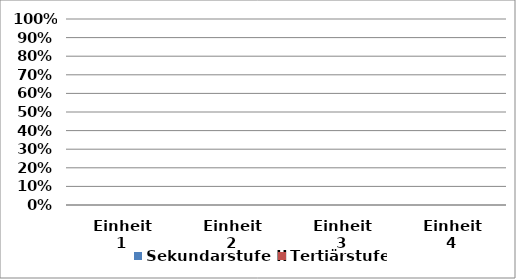
| Category | Sekundarstufe II | Tertiärstufe |
|---|---|---|
| Einheit 1 | 0 | 0 |
| Einheit 2 | 0 | 0 |
| Einheit 3 | 0 | 0 |
| Einheit 4 | 0 | 0 |